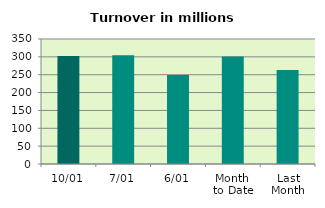
| Category | Series 0 |
|---|---|
| 10/01 | 302.415 |
| 7/01 | 304.597 |
| 6/01 | 249.177 |
| Month 
to Date | 300.799 |
| Last
Month | 263.133 |